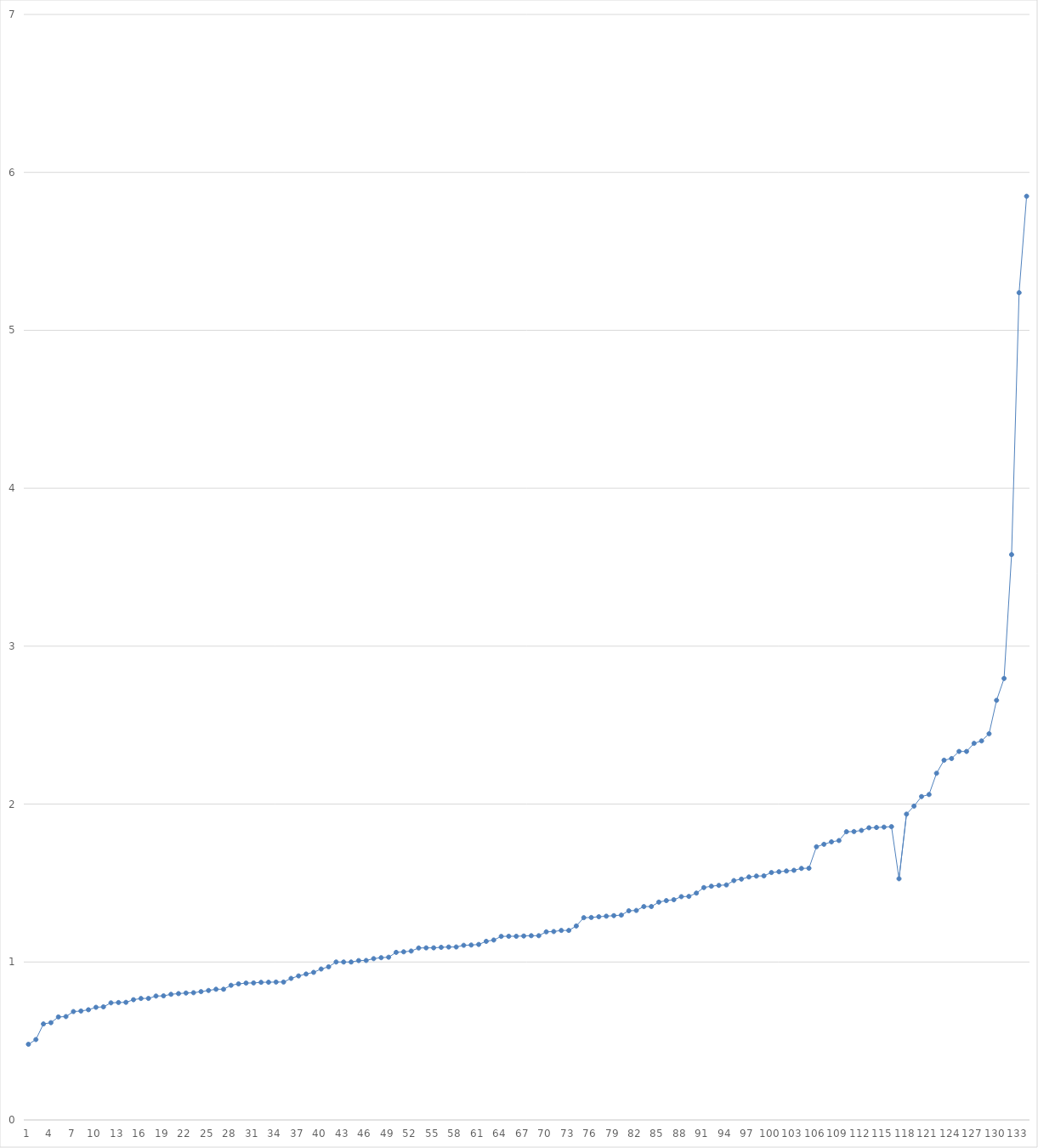
| Category | Series 0 |
|---|---|
| 0 | 0.479 |
| 1 | 0.509 |
| 2 | 0.608 |
| 3 | 0.616 |
| 4 | 0.652 |
| 5 | 0.655 |
| 6 | 0.686 |
| 7 | 0.69 |
| 8 | 0.698 |
| 9 | 0.713 |
| 10 | 0.716 |
| 11 | 0.741 |
| 12 | 0.744 |
| 13 | 0.745 |
| 14 | 0.761 |
| 15 | 0.769 |
| 16 | 0.77 |
| 17 | 0.784 |
| 18 | 0.786 |
| 19 | 0.795 |
| 20 | 0.8 |
| 21 | 0.804 |
| 22 | 0.806 |
| 23 | 0.812 |
| 24 | 0.82 |
| 25 | 0.828 |
| 26 | 0.828 |
| 27 | 0.852 |
| 28 | 0.862 |
| 29 | 0.867 |
| 30 | 0.868 |
| 31 | 0.871 |
| 32 | 0.872 |
| 33 | 0.873 |
| 34 | 0.873 |
| 35 | 0.896 |
| 36 | 0.912 |
| 37 | 0.924 |
| 38 | 0.935 |
| 39 | 0.956 |
| 40 | 0.97 |
| 41 | 1 |
| 42 | 1 |
| 43 | 1 |
| 44 | 1.009 |
| 45 | 1.01 |
| 46 | 1.021 |
| 47 | 1.027 |
| 48 | 1.03 |
| 49 | 1.061 |
| 50 | 1.065 |
| 51 | 1.069 |
| 52 | 1.089 |
| 53 | 1.09 |
| 54 | 1.09 |
| 55 | 1.093 |
| 56 | 1.095 |
| 57 | 1.095 |
| 58 | 1.106 |
| 59 | 1.108 |
| 60 | 1.111 |
| 61 | 1.131 |
| 62 | 1.139 |
| 63 | 1.162 |
| 64 | 1.163 |
| 65 | 1.163 |
| 66 | 1.165 |
| 67 | 1.167 |
| 68 | 1.167 |
| 69 | 1.191 |
| 70 | 1.193 |
| 71 | 1.2 |
| 72 | 1.2 |
| 73 | 1.228 |
| 74 | 1.281 |
| 75 | 1.282 |
| 76 | 1.287 |
| 77 | 1.29 |
| 78 | 1.294 |
| 79 | 1.297 |
| 80 | 1.324 |
| 81 | 1.327 |
| 82 | 1.351 |
| 83 | 1.351 |
| 84 | 1.379 |
| 85 | 1.389 |
| 86 | 1.394 |
| 87 | 1.414 |
| 88 | 1.415 |
| 89 | 1.436 |
| 90 | 1.471 |
| 91 | 1.48 |
| 92 | 1.485 |
| 93 | 1.488 |
| 94 | 1.516 |
| 95 | 1.525 |
| 96 | 1.538 |
| 97 | 1.544 |
| 98 | 1.545 |
| 99 | 1.567 |
| 100 | 1.571 |
| 101 | 1.576 |
| 102 | 1.581 |
| 103 | 1.593 |
| 104 | 1.594 |
| 105 | 1.73 |
| 106 | 1.745 |
| 107 | 1.761 |
| 108 | 1.769 |
| 109 | 1.825 |
| 110 | 1.826 |
| 111 | 1.833 |
| 112 | 1.85 |
| 113 | 1.852 |
| 114 | 1.854 |
| 115 | 1.857 |
| 116 | 1.527 |
| 117 | 1.937 |
| 118 | 1.987 |
| 119 | 2.048 |
| 120 | 2.061 |
| 121 | 2.195 |
| 122 | 2.278 |
| 123 | 2.288 |
| 124 | 2.333 |
| 125 | 2.333 |
| 126 | 2.385 |
| 127 | 2.4 |
| 128 | 2.445 |
| 129 | 2.657 |
| 130 | 2.795 |
| 131 | 3.58 |
| 132 | 5.238 |
| 133 | 5.849 |